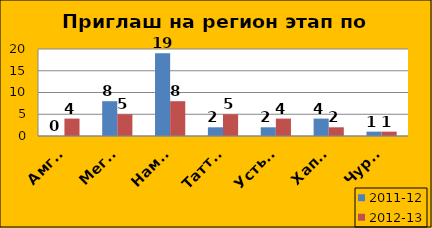
| Category | 2011-12 | 2012-13 |
|---|---|---|
| Амгинский | 0 | 4 |
| Мегино-Кангаласс | 8 | 5 |
| Намский | 19 | 8 |
| Таттинский | 2 | 5 |
| Усть-Алданский | 2 | 4 |
| Хапгаласский | 4 | 2 |
| Чурапчинский | 1 | 1 |